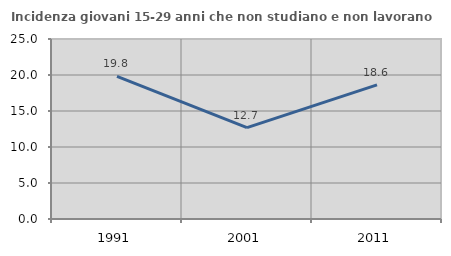
| Category | Incidenza giovani 15-29 anni che non studiano e non lavorano  |
|---|---|
| 1991.0 | 19.799 |
| 2001.0 | 12.698 |
| 2011.0 | 18.636 |